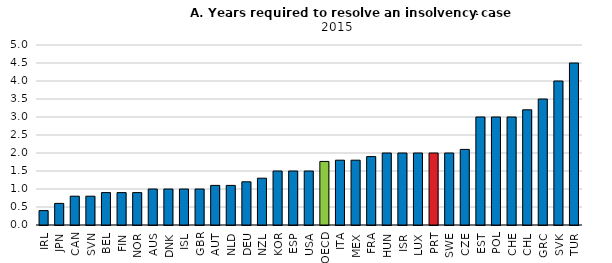
| Category | Time (years) |
|---|---|
| IRL | 0.4 |
| JPN | 0.6 |
| CAN | 0.8 |
| SVN | 0.8 |
| BEL | 0.9 |
| FIN | 0.9 |
| NOR | 0.9 |
| AUS | 1 |
| DNK | 1 |
| ISL | 1 |
| GBR | 1 |
| AUT | 1.1 |
| NLD | 1.1 |
| DEU | 1.2 |
| NZL | 1.3 |
| KOR | 1.5 |
| ESP | 1.5 |
| USA | 1.5 |
| OECD | 1.766 |
| ITA | 1.8 |
| MEX | 1.8 |
| FRA | 1.9 |
| HUN | 2 |
| ISR | 2 |
| LUX | 2 |
| PRT | 2 |
| SWE | 2 |
| CZE | 2.1 |
| EST | 3 |
| POL | 3 |
| CHE | 3 |
| CHL | 3.2 |
| GRC | 3.5 |
| SVK | 4 |
| TUR | 4.5 |